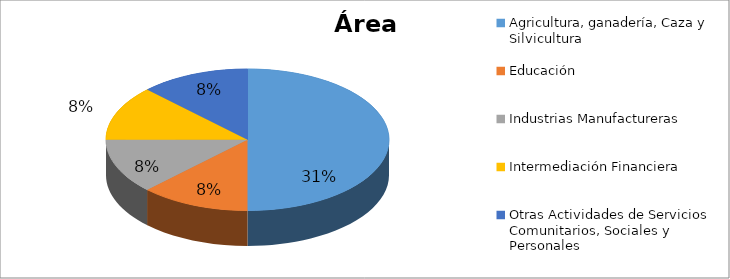
| Category | Series 0 |
|---|---|
| Agricultura, ganadería, Caza y Silvicultura | 0.308 |
| Educación | 0.077 |
| Industrias Manufactureras | 0.077 |
| Intermediación Financiera | 0.077 |
| Otras Actividades de Servicios Comunitarios, Sociales y Personales | 0.077 |